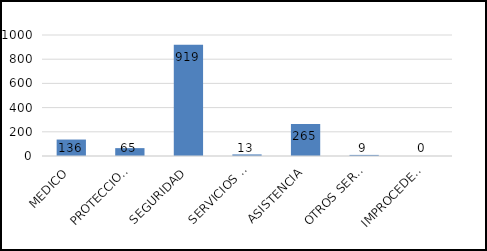
| Category | TOTAL |
|---|---|
| MEDICO | 136 |
| PROTECCION CIVIL | 65 |
| SEGURIDAD | 919 |
| SERVICIOS PUBLICOS | 13 |
| ASISTENCIA | 265 |
| OTROS SERVICIOS | 9 |
| IMPROCEDENTES | 0 |